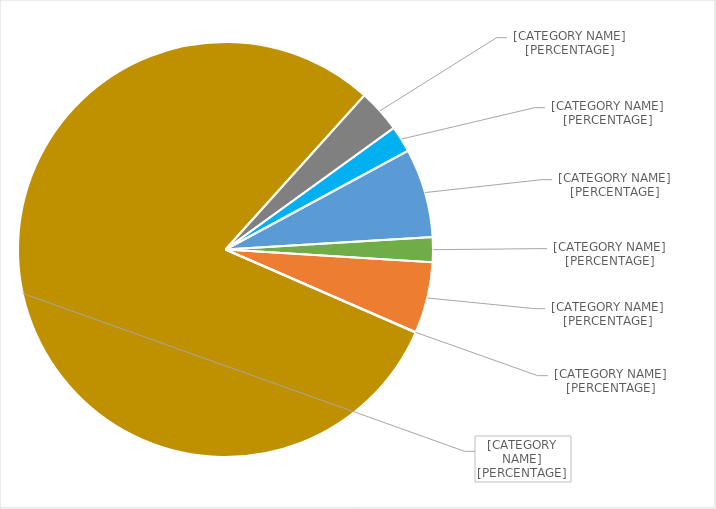
| Category | Series 0 |
|---|---|
| Coal Burned on Campus | 149299.715 |
| Solar Power Generated on Campus | 91218.865 |
| Purchased Solar Power  | 307080 |
| Purchased Wind Power | 85579.443 |
| Purchased Grid Power | 244879.133 |
| Biomass Boiler and Solar Thermal | 1591.918 |
| Natural Gas Burned on Campus | 3543025.5 |